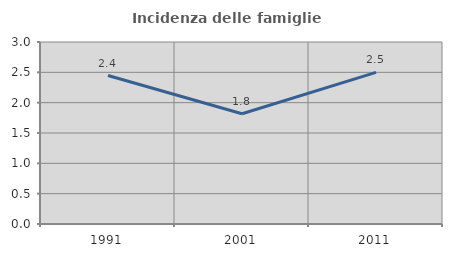
| Category | Incidenza delle famiglie numerose |
|---|---|
| 1991.0 | 2.448 |
| 2001.0 | 1.818 |
| 2011.0 | 2.5 |